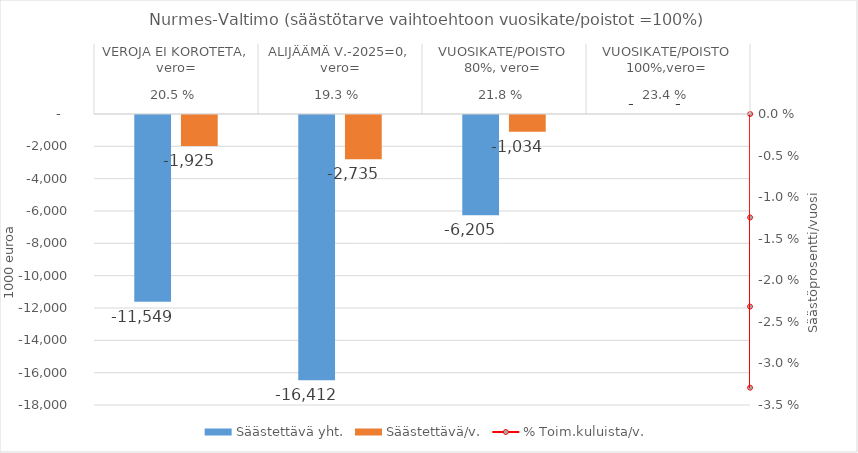
| Category | Säästettävä yht. | Säästettävä/v. |
|---|---|---|
| 0 | -11548.87 | -1924.812 |
| 1 | -16412.111 | -2735.352 |
| 2 | -6205.143 | -1034.19 |
| 3 | 0 | 0 |